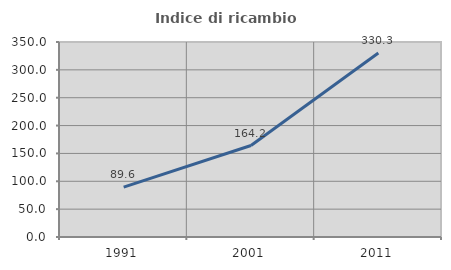
| Category | Indice di ricambio occupazionale  |
|---|---|
| 1991.0 | 89.57 |
| 2001.0 | 164.23 |
| 2011.0 | 330.272 |